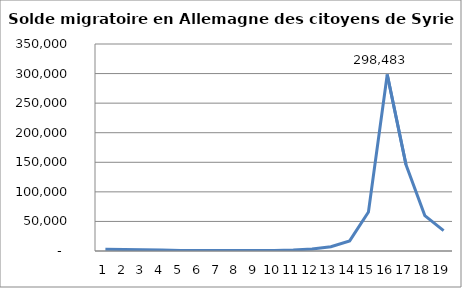
| Category | Series 0 |
|---|---|
| 0 | 2994 |
| 1 | 2557 |
| 2 | 2297 |
| 3 | 1528 |
| 4 | 985 |
| 5 | 967 |
| 6 | 656 |
| 7 | 699 |
| 8 | 789 |
| 9 | 921 |
| 10 | 1769 |
| 11 | 3500 |
| 12 | 7286 |
| 13 | 17057 |
| 14 | 65921 |
| 15 | 298483 |
| 16 | 145823 |
| 17 | 59935 |
| 18 | 34350 |